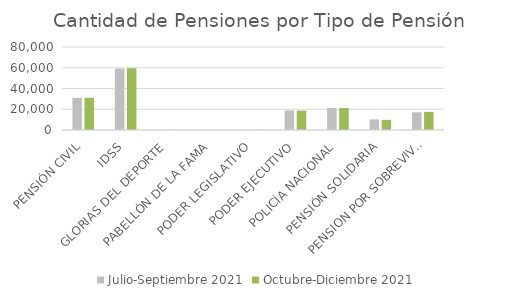
| Category | Julio-Septiembre 2021 | Octubre-Diciembre 2021 |
|---|---|---|
| PENSIÓN CIVIL | 31019 | 31137 |
| IDSS | 59255 | 59538 |
| GLORIAS DEL DEPORTE | 276 | 272 |
| PABELLÓN DE LA FAMA | 164 | 165 |
| PODER LEGISLATIVO | 304 | 291 |
| PODER EJECUTIVO | 18929 | 18719 |
| POLICÍA NACIONAL | 21161 | 21144 |
| PENSIÓN SOLIDARIA | 10167 | 9753 |
| PENSION POR SOBREVIVENCIA | 17066 | 17481 |